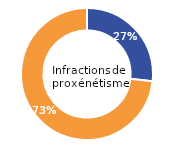
| Category | Femmes |
|---|---|
| Femmes | 26.758 |
| Hommes | 73.242 |